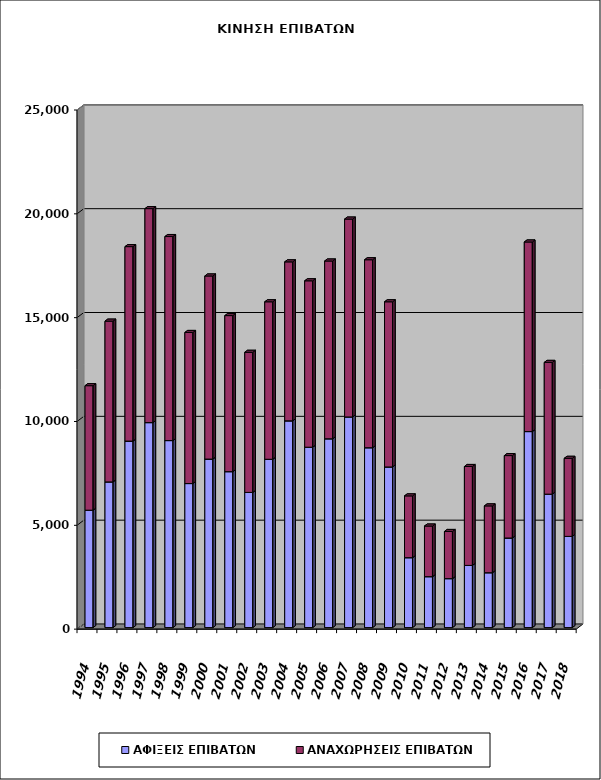
| Category | ΑΦΙΞΕΙΣ ΕΠΙΒΑΤΩΝ | ΑΝΑΧΩΡΗΣΕΙΣ ΕΠΙΒΑΤΩΝ |
|---|---|---|
| 1994.0 | 5655 | 5995 |
| 1995.0 | 7017 | 7741 |
| 1996.0 | 8982 | 9365 |
| 1997.0 | 9872 | 10305 |
| 1998.0 | 9007 | 9825 |
| 1999.0 | 6937 | 7276 |
| 2000.0 | 8116 | 8817 |
| 2001.0 | 7510 | 7515 |
| 2002.0 | 6510 | 6747 |
| 2003.0 | 8107 | 7583 |
| 2004.0 | 9957 | 7656 |
| 2005.0 | 8688 | 8013 |
| 2006.0 | 9093 | 8561 |
| 2007.0 | 10145 | 9528 |
| 2008.0 | 8662 | 9053 |
| 2009.0 | 7737 | 7953 |
| 2010.0 | 3367 | 2976 |
| 2011.0 | 2453 | 2438 |
| 2012.0 | 2358 | 2271 |
| 2013.0 | 2995 | 4763 |
| 2014.0 | 2643 | 3218 |
| 2015.0 | 4315 | 3969 |
| 2016.0 | 9440 | 9130 |
| 2017.0 | 6427 | 6344 |
| 2018.0 | 4393 | 3759 |